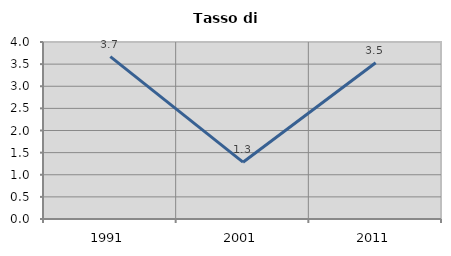
| Category | Tasso di disoccupazione   |
|---|---|
| 1991.0 | 3.668 |
| 2001.0 | 1.284 |
| 2011.0 | 3.529 |